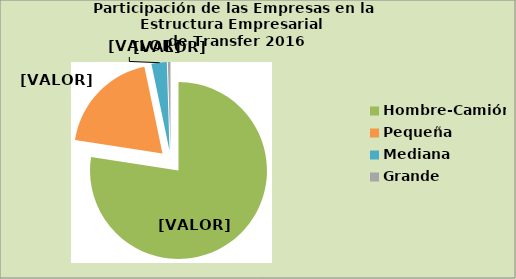
| Category | Series 0 |
|---|---|
| Hombre-Camión | 77.4 |
| Pequeña | 19.266 |
| Mediana | 2.794 |
| Grande | 0.486 |